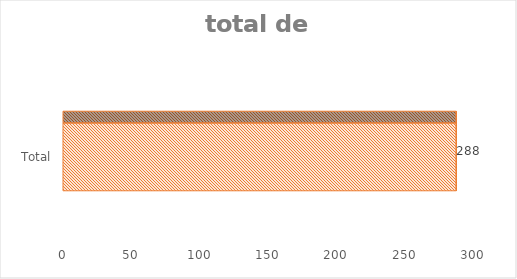
| Category | Total |
|---|---|
| Total | 288 |